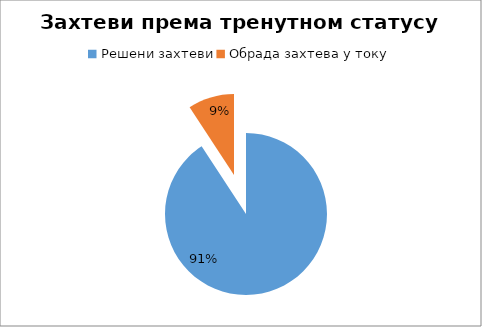
| Category | Series 0 |
|---|---|
| Решени захтеви | 0.908 |
| Обрада захтева у току | 0.092 |